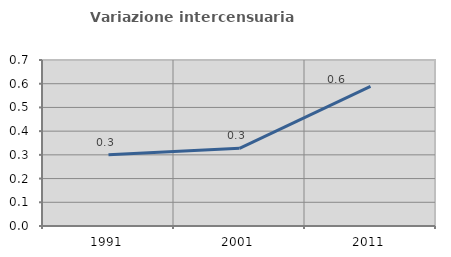
| Category | Variazione intercensuaria annua |
|---|---|
| 1991.0 | 0.301 |
| 2001.0 | 0.327 |
| 2011.0 | 0.589 |